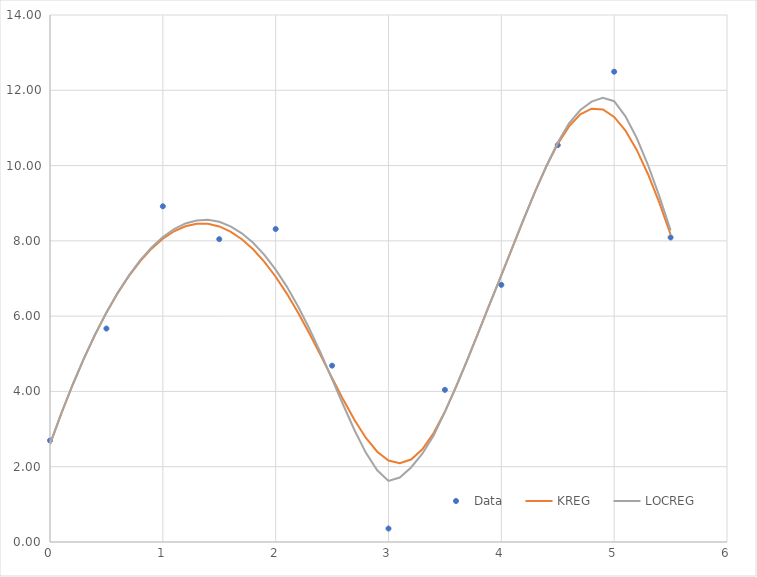
| Category | Data |
|---|---|
| 0.0 | 2.697 |
| 0.5 | 5.67 |
| 1.0 | 8.919 |
| 1.5 | 8.045 |
| 2.0 | 8.314 |
| 2.5 | 4.684 |
| 3.0 | 0.358 |
| 3.5 | 4.041 |
| 4.0 | 6.831 |
| 4.5 | 10.544 |
| 5.0 | 12.494 |
| 5.5 | 8.09 |